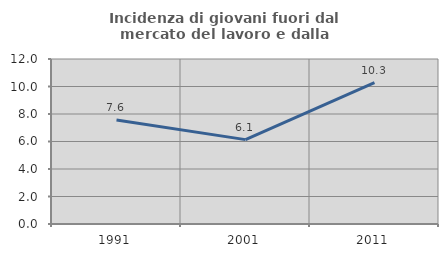
| Category | Incidenza di giovani fuori dal mercato del lavoro e dalla formazione  |
|---|---|
| 1991.0 | 7.566 |
| 2001.0 | 6.137 |
| 2011.0 | 10.288 |